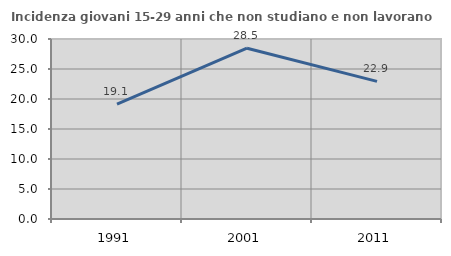
| Category | Incidenza giovani 15-29 anni che non studiano e non lavorano  |
|---|---|
| 1991.0 | 19.129 |
| 2001.0 | 28.465 |
| 2011.0 | 22.937 |